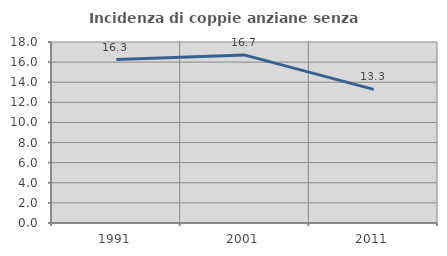
| Category | Incidenza di coppie anziane senza figli  |
|---|---|
| 1991.0 | 16.252 |
| 2001.0 | 16.699 |
| 2011.0 | 13.29 |